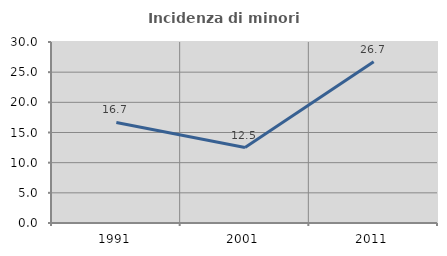
| Category | Incidenza di minori stranieri |
|---|---|
| 1991.0 | 16.667 |
| 2001.0 | 12.5 |
| 2011.0 | 26.733 |